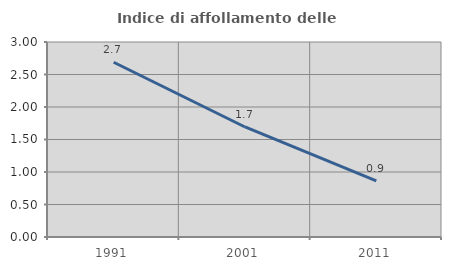
| Category | Indice di affollamento delle abitazioni  |
|---|---|
| 1991.0 | 2.689 |
| 2001.0 | 1.693 |
| 2011.0 | 0.863 |